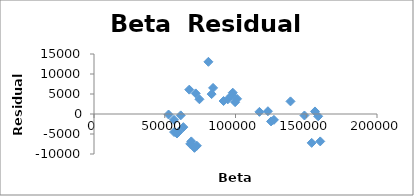
| Category | Series 0 |
|---|---|
| 59809.8 | -4433.695 |
| 68769.3 | -6852.35 |
| 70999.0 | -8460.225 |
| 72702.1 | -7938.986 |
| 68025.9 | -7469.677 |
| 63147.4 | -3281.832 |
| 56543.6 | -1449.459 |
| 58627.5 | -4882.458 |
| 56589.8 | -4513.918 |
| 52678.7 | -129.305 |
| 61275.0 | -343.949 |
| 74517.4 | 3682.966 |
| 67338.6 | 6087.953 |
| 71881.3 | 5145.036 |
| 84175.6 | 6526.66 |
| 80859.3 | 13042.992 |
| 83132.9 | 4973.528 |
| 97323.7 | 4637.548 |
| 98067.2 | 5328.945 |
| 99746.4 | 2960.347 |
| 94553.2 | 3657.073 |
| 91574.3 | 3243.21 |
| 101097.6 | 3790.504 |
| 122921.6 | 692.558 |
| 116905.6 | 533.988 |
| 125131.9 | -1857.465 |
| 127134.9 | -1466.895 |
| 148723.6 | -371.093 |
| 138859.4 | 3152.527 |
| 156176.2 | 639.055 |
| 153837.1 | -7215.299 |
| 158444.1 | -574.448 |
| 159879.9 | -6853.837 |